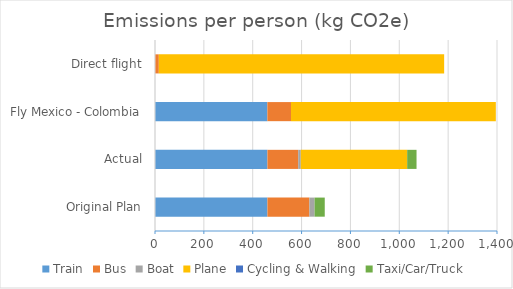
| Category | Train | Bus | Boat | Plane | Cycling & Walking | Taxi/Car/Truck |
|---|---|---|---|---|---|---|
| Original Plan | 460.28 | 171.72 | 21.2 | 0 | 0 | 41.7 |
| Actual | 460.28 | 125.88 | 10.6 | 435.51 | 0 | 38.35 |
| Fly Mexico - Colombia | 460 | 96.7 | 0 | 838.52 | 0 | 0 |
| Direct flight | 0 | 15.65 | 0 | 1168.03 | 0 | 0 |